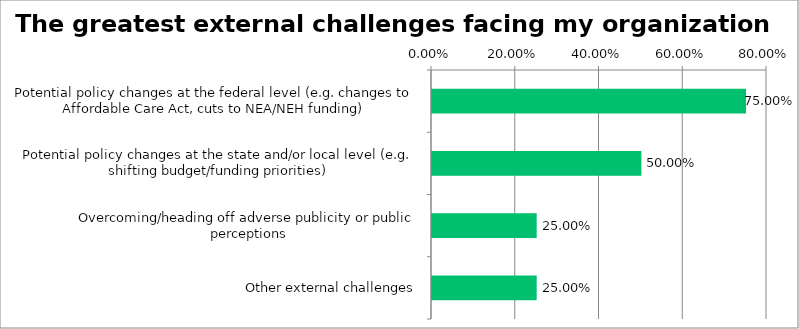
| Category | Responses |
|---|---|
| Potential policy changes at the federal level (e.g. changes to Affordable Care Act, cuts to NEA/NEH funding) | 0.75 |
| Potential policy changes at the state and/or local level (e.g. shifting budget/funding priorities) | 0.5 |
| Overcoming/heading off adverse publicity or public perceptions | 0.25 |
| Other external challenges | 0.25 |